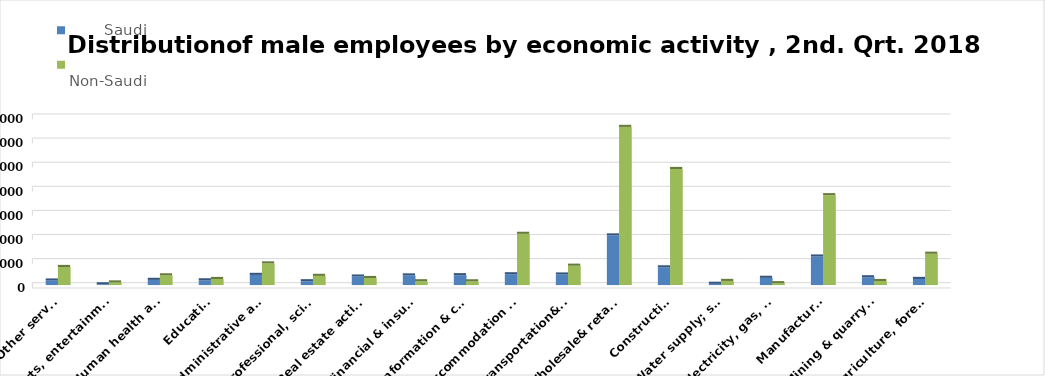
| Category |        Saudi      |          Non-Saudi        |
|---|---|---|
| Agriculture, forestry & fishing | 50528 | 259693 |
| Mining & quarrying | 64191 | 33392 |
| Manufacturing | 236526 | 745563 |
| Electricity, gas, steam & air conditioning supply | 59763 | 15269 |
| Water supply; sewerage, waste remediation  | 10381 | 34173 |
| Construction | 146560 | 962951 |
| Wholesale& retail trade; repair of motor vehicles | 411594 | 1312198 |
| Transportation& storage | 87362 | 160399 |
| Accommodation & food service activities | 89151 | 424939 |
| Information & communication | 81390 | 30749 |
| Financial & insurance | 79635 | 31262 |
| Real estate activities | 70369 | 58315 |
| Professional, scientific & technical activities | 31406 | 76014 |
| Administrative and support service activities | 84133 | 179500 |
| Education | 38960 | 50232 |
| Human health and &l work activities | 42904 | 80429 |
| Arts, entertainment & recreation | 5934 | 21610 |
| Other service | 37486 | 149765 |